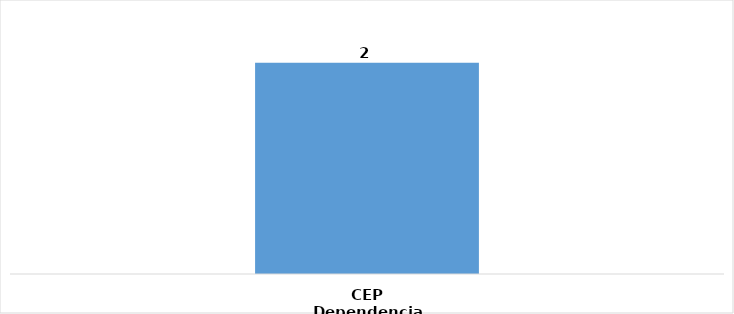
| Category | Total |
|---|---|
| CEP Dependencia | 2 |